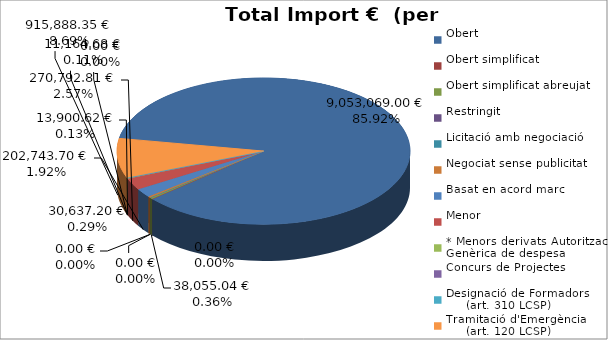
| Category | Total preu
(amb IVA) |
|---|---|
| Obert | 9053069 |
| Obert simplificat | 0 |
| Obert simplificat abreujat | 38055.04 |
| Restringit | 0 |
| Licitació amb negociació | 0 |
| Negociat sense publicitat | 30637.2 |
| Basat en acord marc | 202743.7 |
| Menor | 270792.81 |
| * Menors derivats Autorització Genèrica de despesa | 13900.62 |
| Concurs de Projectes | 0 |
| Designació de Formadors
     (art. 310 LCSP) | 11164.68 |
| Tramitació d'Emergència
     (art. 120 LCSP) | 915888.35 |